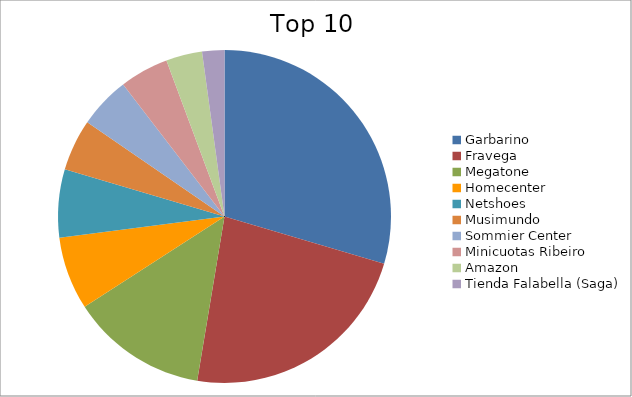
| Category | Series 0 |
|---|---|
| Garbarino | 29.59 |
| Fravega | 23.04 |
| Megatone | 13.25 |
| Homecenter | 7.1 |
| Netshoes | 6.6 |
| Musimundo | 5.01 |
| Sommier Center | 5 |
| Minicuotas Ribeiro | 4.75 |
| Amazon | 3.51 |
| Tienda Falabella (Saga) | 2.16 |